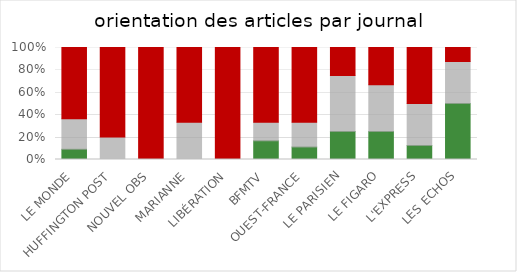
| Category | Series 0 | Series 1 | Series 2 |
|---|---|---|---|
| LE MONDE | 0.091 | 0.273 | 0.636 |
| HUFFINGTON POST | 0 | 0.2 | 0.8 |
| NOUVEL OBS | 0 | 0 | 1 |
| MARIANNE | 0 | 0.333 | 0.667 |
| LIBÉRATION | 0 | 0 | 1 |
| BFMTV | 0.167 | 0.167 | 0.667 |
| OUEST-FRANCE | 0.111 | 0.222 | 0.667 |
| LE PARISIEN | 0.25 | 0.5 | 0.25 |
| LE FIGARO | 0.25 | 0.417 | 0.333 |
| L'EXPRESS | 0.125 | 0.375 | 0.5 |
| LES ECHOS | 0.5 | 0.375 | 0.125 |